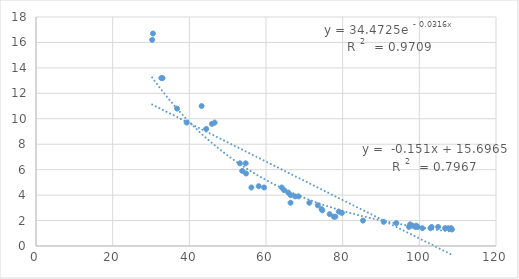
| Category | Series 0 |
|---|---|
| 66.4 | 4 |
| 53.2 | 6.5 |
| 90.7 | 1.9 |
| 108.5 | 1.3 |
| 30.3 | 16.2 |
| 64.1 | 4.6 |
| 71.3 | 3.4 |
| 33.0 | 13.2 |
| 65.8 | 4.2 |
| 85.3 | 2 |
| 107.5 | 1.4 |
| 74.7 | 2.8 |
| 74.5 | 2.9 |
| 97.3 | 1.5 |
| 76.6 | 2.5 |
| 94.0 | 1.8 |
| 104.9 | 1.5 |
| 97.6 | 1.7 |
| 99.0 | 1.5 |
| 32.7 | 13.2 |
| 44.4 | 9.2 |
| 56.2 | 4.6 |
| 77.7 | 2.3 |
| 54.8 | 5.7 |
| 106.7 | 1.4 |
| 73.5 | 3.2 |
| 53.8 | 5.9 |
| 66.4 | 3.4 |
| 98.2 | 1.6 |
| 58.1 | 4.7 |
| 36.8 | 10.8 |
| 43.2 | 11 |
| 64.7 | 4.4 |
| 79.8 | 2.6 |
| 100.8 | 1.4 |
| 59.5 | 4.6 |
| 103.2 | 1.5 |
| 30.5 | 16.7 |
| 99.6 | 1.5 |
| 79.0 | 2.7 |
| 45.9 | 9.6 |
| 68.5 | 3.9 |
| 102.9 | 1.4 |
| 78.1 | 2.3 |
| 67.6 | 3.9 |
| 99.2 | 1.6 |
| 39.3 | 9.7 |
| 54.7 | 6.5 |
| 108.3 | 1.4 |
| 46.6 | 9.7 |